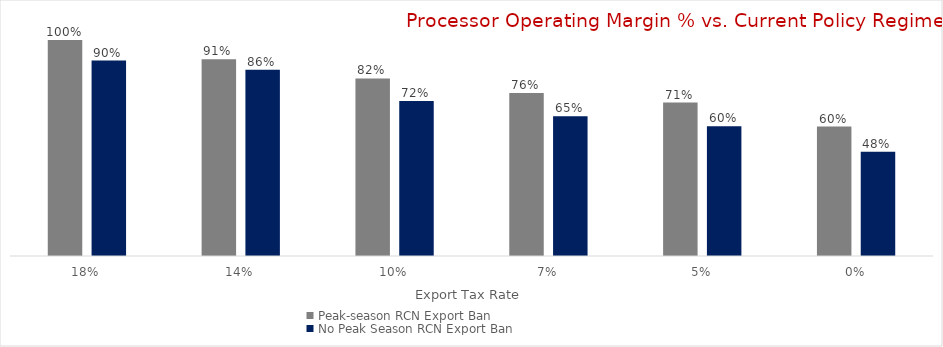
| Category | Peak-season RCN Export Ban | No Peak Season RCN Export Ban |
|---|---|---|
| 0.18 | 1 | 0.905 |
| 0.14 | 0.911 | 0.863 |
| 0.1 | 0.822 | 0.717 |
| 0.07 | 0.755 | 0.647 |
| 0.05 | 0.711 | 0.6 |
| 0.0 | 0.599 | 0.483 |